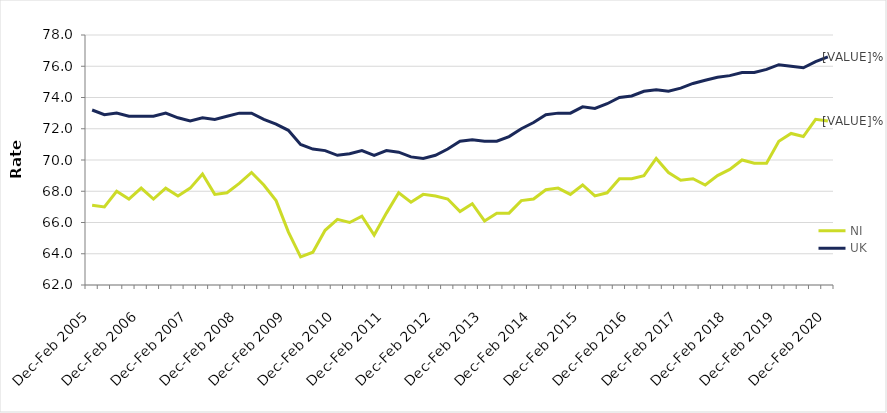
| Category | NI | UK |
|---|---|---|
| Dec-Feb 2005 | 67.1 | 73.2 |
| Mar-May 2005 | 67 | 72.9 |
| Jun-Aug 2005 | 68 | 73 |
| Sep-Nov 2005 | 67.5 | 72.8 |
| Dec-Feb 2006 | 68.2 | 72.8 |
| Mar-May 2006 | 67.5 | 72.8 |
| Jun-Aug 2006 | 68.2 | 73 |
| Sep-Nov 2006 | 67.7 | 72.7 |
| Dec-Feb 2007 | 68.2 | 72.5 |
| Mar-May 2007 | 69.1 | 72.7 |
| Jun-Aug 2007 | 67.8 | 72.6 |
| Sep-Nov 2007 | 67.9 | 72.8 |
| Dec-Feb 2008 | 68.5 | 73 |
| Mar-May 2008 | 69.2 | 73 |
| Jun-Aug 2008 | 68.4 | 72.6 |
| Sep-Nov 2008 | 67.4 | 72.3 |
| Dec-Feb 2009 | 65.4 | 71.9 |
| Mar-May 2009 | 63.8 | 71 |
| Jun-Aug 2009 | 64.1 | 70.7 |
| Sep-Nov 2009 | 65.5 | 70.6 |
| Dec-Feb 2010 | 66.2 | 70.3 |
| Mar-May 2010 | 66 | 70.4 |
| Jun-Aug 2010 | 66.4 | 70.6 |
| Sep-Nov 2010 | 65.2 | 70.3 |
| Dec-Feb 2011 | 66.6 | 70.6 |
| Mar-May 2011 | 67.9 | 70.5 |
| Jun-Aug 2011 | 67.3 | 70.2 |
| Sep-Nov 2011 | 67.8 | 70.1 |
| Dec-Feb 2012 | 67.7 | 70.3 |
| Mar-May 2012 | 67.5 | 70.7 |
| Jun-Aug 2012 | 66.7 | 71.2 |
| Sep-Nov 2012 | 67.2 | 71.3 |
| Dec-Feb 2013 | 66.1 | 71.2 |
| Mar-May 2013 | 66.6 | 71.2 |
| Jun-Aug 2013 | 66.6 | 71.5 |
| Sep-Nov 2013 | 67.4 | 72 |
| Dec-Feb 2014 | 67.5 | 72.4 |
| Mar-May 2014 | 68.1 | 72.9 |
| Jun-Aug 2014 | 68.2 | 73 |
| Sep-Nov 2014 | 67.8 | 73 |
| Dec-Feb 2015 | 68.4 | 73.4 |
| Mar-May 2015 | 67.7 | 73.3 |
| Jun-Aug 2015 | 67.9 | 73.6 |
| Sep-Nov 2015 | 68.8 | 74 |
| Dec-Feb 2016 | 68.8 | 74.1 |
| Mar-May 2016 | 69 | 74.4 |
| Jun-Aug 2016 | 70.1 | 74.5 |
| Sep-Nov 2016 | 69.2 | 74.4 |
| Dec-Feb 2017 | 68.7 | 74.6 |
| Mar-May 2017 | 68.8 | 74.9 |
| Jun-Aug 2017 | 68.4 | 75.1 |
| Sep-Nov 2017 | 69 | 75.3 |
| Dec-Feb 2018 | 69.4 | 75.4 |
| Mar-May 2018 | 70 | 75.6 |
| Jun-Aug 2018 | 69.8 | 75.6 |
| Sep-Nov 2018 | 69.8 | 75.8 |
| Dec-Feb 2019 | 71.2 | 76.1 |
| Mar-May 2019 | 71.7 | 76 |
| Jun-Aug 2019 | 71.5 | 75.9 |
| Sep-Nov 2019 | 72.6 | 76.3 |
| Dec-Feb 2020 | 72.5 | 76.6 |